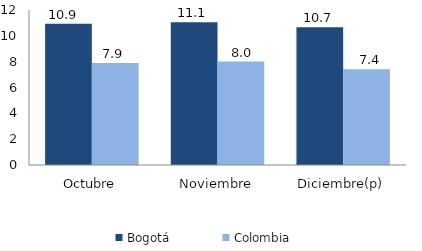
| Category | Bogotá | Colombia |
|---|---|---|
| Octubre | 10.927 | 7.892 |
| Noviembre | 11.059 | 8.013 |
| Diciembre(p) | 10.67 | 7.418 |